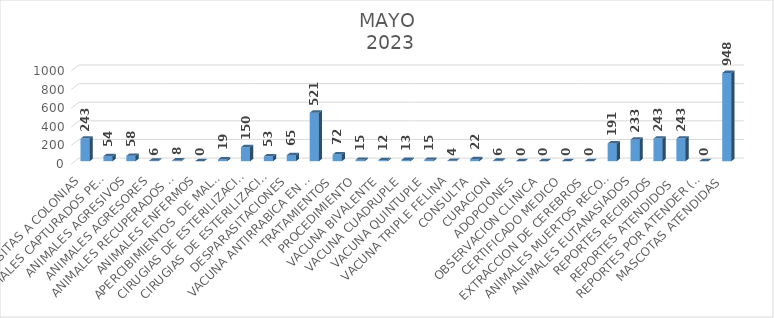
| Category | Series 0 |
|---|---|
| VISITAS A COLONIAS | 243 |
| ANIMALES CAPTURADOS PERROS Y GATOS  | 54 |
| ANIMALES AGRESIVOS | 58 |
| ANIMALES AGRESORES | 6 |
| ANIMALES RECUPERADOS POR SUS DUEÑOS | 8 |
| ANIMALES ENFERMOS | 0 |
| APERCIBIMIENTOS  DE MALTRATO ANIMAL | 19 |
| CIRUGIAS DE ESTERILIZACION (OVH) hembra | 150 |
| CIRUGIAS DE ESTERILIZACION (ORQ) macho | 53 |
| DESPARASITACIONES | 65 |
| VACUNA ANTIRRABICA EN OFICINA Y CAMPAÑAS  | 521 |
| TRATAMIENTOS | 72 |
| PROCEDIMIENTO | 15 |
| VACUNA BIVALENTE | 12 |
| VACUNA CUADRUPLE | 13 |
| VACUNA QUINTUPLE | 15 |
| VACUNA TRIPLE FELINA | 4 |
| CONSULTA | 22 |
| CURACION | 6 |
| ADOPCIONES | 0 |
| OBSERVACION CLINICA | 0 |
| CERTIFICADO MEDICO | 0 |
| EXTRACCION DE CEREBROS | 0 |
| ANIMALES MUERTOS RECOLECTADOS | 191 |
| ANIMALES EUTANASIADOS | 233 |
| REPORTES RECIBIDOS | 243 |
| REPORTES ATENDIDOS  | 243 |
| REPORTES POR ATENDER (PENDIENTES) | 0 |
| MASCOTAS ATENDIDAS | 948 |